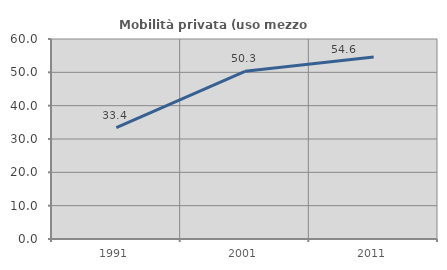
| Category | Mobilità privata (uso mezzo privato) |
|---|---|
| 1991.0 | 33.391 |
| 2001.0 | 50.316 |
| 2011.0 | 54.601 |